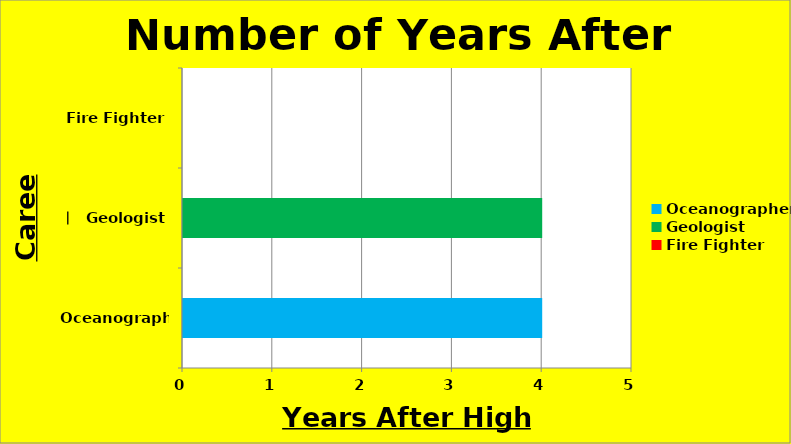
| Category | Number of years after H.S. |
|---|---|
| Oceanographer | 4 |
| Geologist | 4 |
| Fire Fighter | 0 |